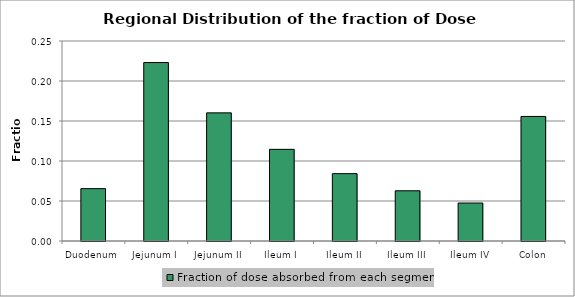
| Category | Fraction of dose absorbed from each segment |
|---|---|
| Duodenum | 0.065 |
| Jejunum I | 0.223 |
| Jejunum II | 0.16 |
| Ileum I | 0.115 |
| Ileum II | 0.084 |
| Ileum III | 0.063 |
| Ileum IV | 0.047 |
| Colon | 0.156 |